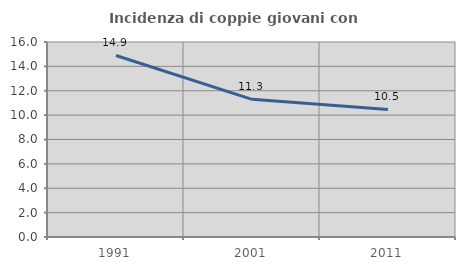
| Category | Incidenza di coppie giovani con figli |
|---|---|
| 1991.0 | 14.894 |
| 2001.0 | 11.293 |
| 2011.0 | 10.468 |